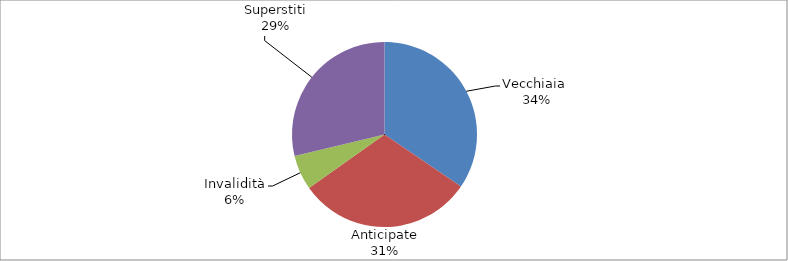
| Category | Series 0 |
|---|---|
| Vecchiaia  | 21740 |
| Anticipate | 19302 |
| Invalidità | 3823 |
| Superstiti | 18105 |